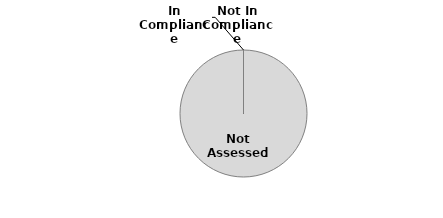
| Category | Series 0 |
|---|---|
| Not Assessed | 4 |
| In Compliance | 0 |
| Not In Compliance | 0 |